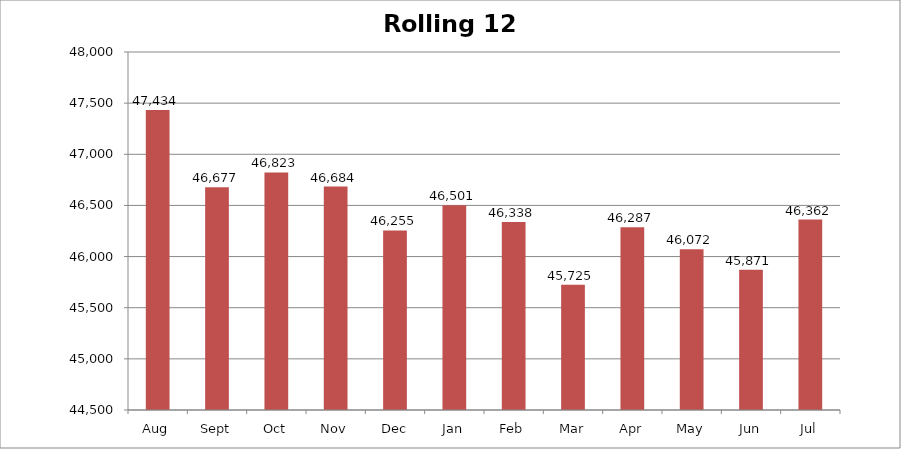
| Category | Rolling 12 Month |
|---|---|
| Aug | 47434 |
| Sept | 46677 |
| Oct | 46823 |
| Nov | 46684 |
| Dec | 46255 |
| Jan | 46501 |
| Feb | 46338 |
| Mar | 45725 |
| Apr | 46287 |
| May | 46072 |
| Jun | 45871 |
| Jul | 46362 |